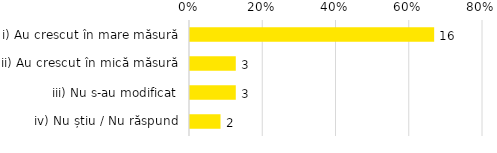
| Category | Total |
|---|---|
| i) Au crescut în mare măsură | 0.667 |
| ii) Au crescut în mică măsură | 0.125 |
| iii) Nu s-au modificat | 0.125 |
| iv) Nu știu / Nu răspund | 0.083 |